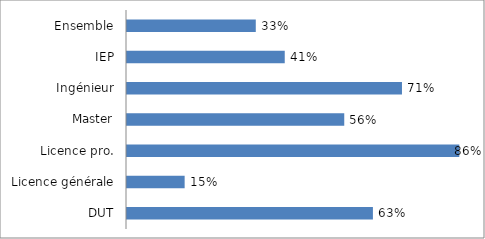
| Category | Series 0 |
|---|---|
| DUT | 0.634 |
| Licence générale | 0.149 |
| Licence pro. | 0.857 |
| Master | 0.56 |
| Ingénieur | 0.709 |
| IEP | 0.407 |
| Ensemble | 0.332 |